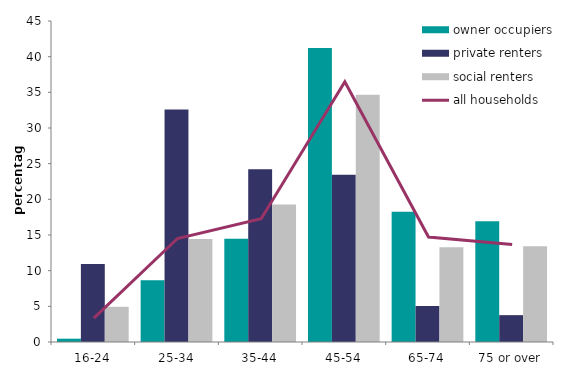
| Category | owner occupiers | private renters | social renters |
|---|---|---|---|
| 16-24 | 0.463 | 10.928 | 4.933 |
| 25-34 | 8.654 | 32.582 | 14.431 |
| 35-44 | 14.481 | 24.228 | 19.264 |
| 45-54 | 41.222 | 23.434 | 34.656 |
| 65-74 | 18.251 | 5.064 | 13.288 |
| 75 or over | 16.929 | 3.764 | 13.428 |